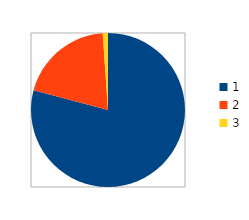
| Category | Series 0 |
|---|---|
| 0 | 4718597 |
| 1 | 1179648 |
| 2 | 65536 |